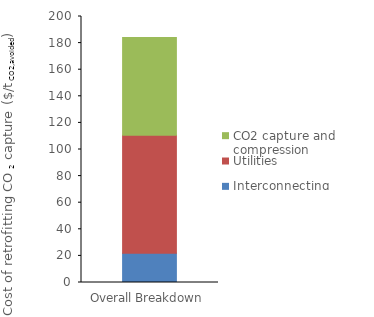
| Category | Interconnecting | Utilities | CO2 capture and compression |
|---|---|---|---|
| 0 | 21.975 | 88.728 | 73.515 |